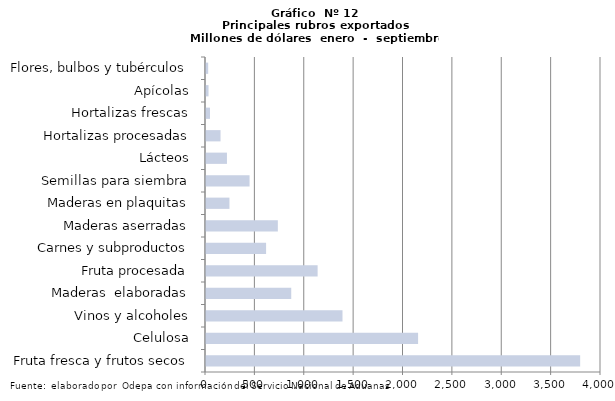
| Category | Series 7 |
|---|---|
| Fruta fresca y frutos secos | 3788862.196 |
| Celulosa | 2147709.551 |
| Vinos y alcoholes | 1382183.057 |
| Maderas  elaboradas | 863152.51 |
| Fruta procesada | 1130306.806 |
| Carnes y subproductos | 608450.748 |
| Maderas aserradas | 727467.942 |
| Maderas en plaquitas | 237485.004 |
| Semillas para siembra | 441042.611 |
| Lácteos | 212237.549 |
| Hortalizas procesadas | 147102.186 |
| Hortalizas frescas | 40295.975 |
| Apícolas | 25574.529 |
| Flores, bulbos y tubérculos | 21930.789 |